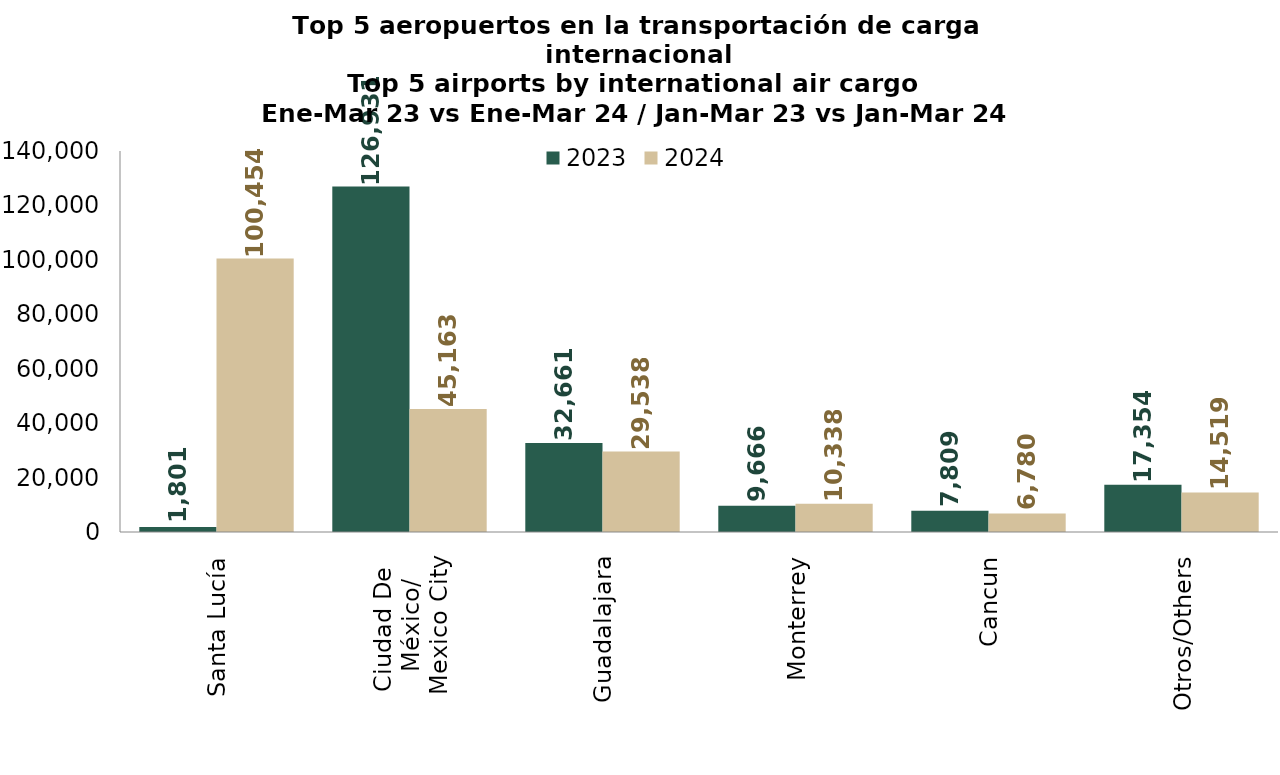
| Category | 2023 | 2024 |
|---|---|---|
| Santa Lucía | 1800.893 | 100454.122 |
| Ciudad De 
México/
Mexico City | 126930.95 | 45162.6 |
| Guadalajara | 32661.186 | 29537.834 |
| Monterrey | 9665.589 | 10338.105 |
| Cancun | 7808.558 | 6780.482 |
| Otros/Others | 17354.317 | 14519.148 |